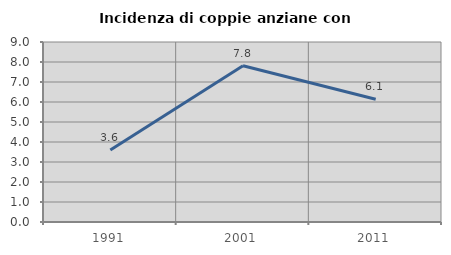
| Category | Incidenza di coppie anziane con figli |
|---|---|
| 1991.0 | 3.597 |
| 2001.0 | 7.812 |
| 2011.0 | 6.14 |